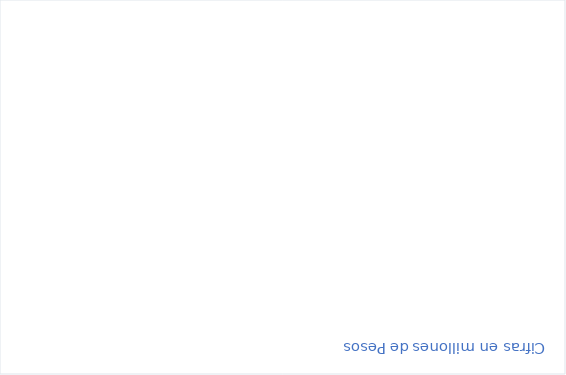
| Category | RESERVAS CONSTITUIDAS
 | CANCELACIONES RESERVAS PRESUPUESTALES
  | PAGOS
ACUMULADOS
 |
|---|---|---|---|
| Total | 55446.915 | 0 | 38925.896 |